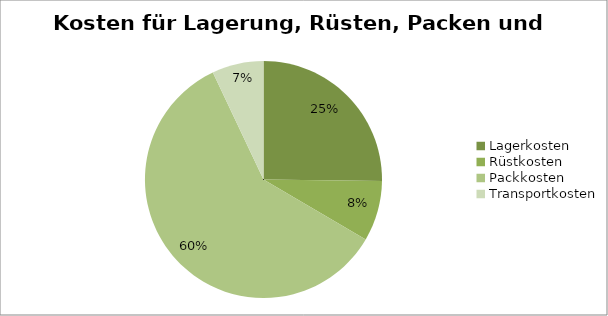
| Category | Series 0 |
|---|---|
| Lagerkosten | 0.138 |
| Rüstkosten | 0.045 |
| Packkosten | 0.325 |
| Transportkosten | 0.038 |